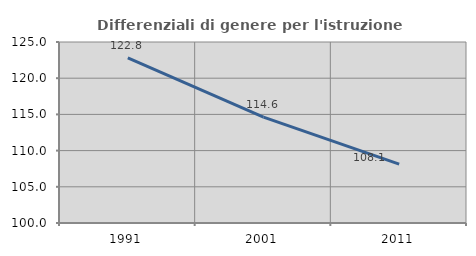
| Category | Differenziali di genere per l'istruzione superiore |
|---|---|
| 1991.0 | 122.793 |
| 2001.0 | 114.619 |
| 2011.0 | 108.142 |